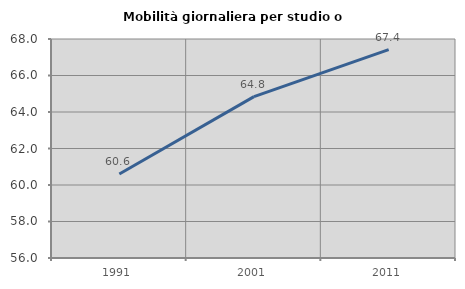
| Category | Mobilità giornaliera per studio o lavoro |
|---|---|
| 1991.0 | 60.602 |
| 2001.0 | 64.845 |
| 2011.0 | 67.416 |